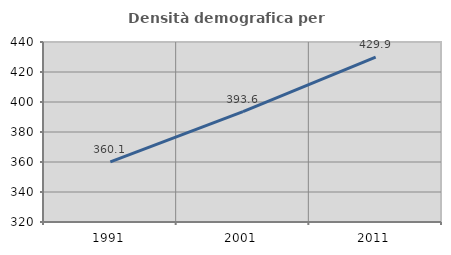
| Category | Densità demografica |
|---|---|
| 1991.0 | 360.106 |
| 2001.0 | 393.582 |
| 2011.0 | 429.928 |